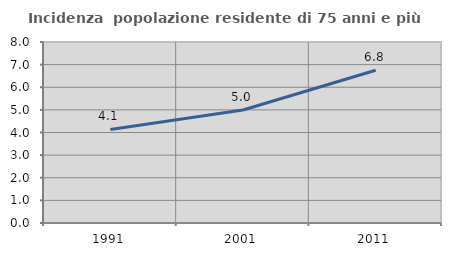
| Category | Incidenza  popolazione residente di 75 anni e più |
|---|---|
| 1991.0 | 4.134 |
| 2001.0 | 4.995 |
| 2011.0 | 6.752 |